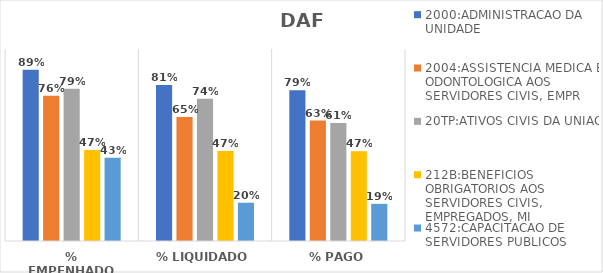
| Category | 2000:ADMINISTRACAO DA UNIDADE | 2004:ASSISTENCIA MEDICA E ODONTOLOGICA AOS SERVIDORES CIVIS, EMPR | 20TP:ATIVOS CIVIS DA UNIAO | 212B:BENEFICIOS OBRIGATORIOS AOS SERVIDORES CIVIS, EMPREGADOS, MI | 4572:CAPACITACAO DE SERVIDORES PUBLICOS FEDERAIS EM PROCESSO DE Q |
|---|---|---|---|---|---|
| % EMPENHADO | 0.892 | 0.757 | 0.793 | 0.474 | 0.434 |
| % LIQUIDADO | 0.812 | 0.646 | 0.741 | 0.469 | 0.199 |
| % PAGO | 0.785 | 0.627 | 0.614 | 0.467 | 0.194 |